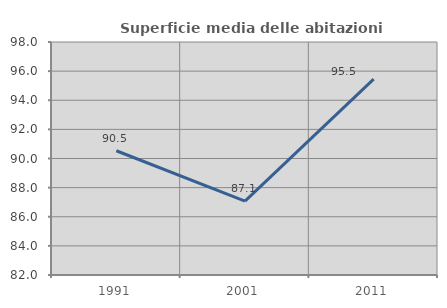
| Category | Superficie media delle abitazioni occupate |
|---|---|
| 1991.0 | 90.531 |
| 2001.0 | 87.071 |
| 2011.0 | 95.454 |